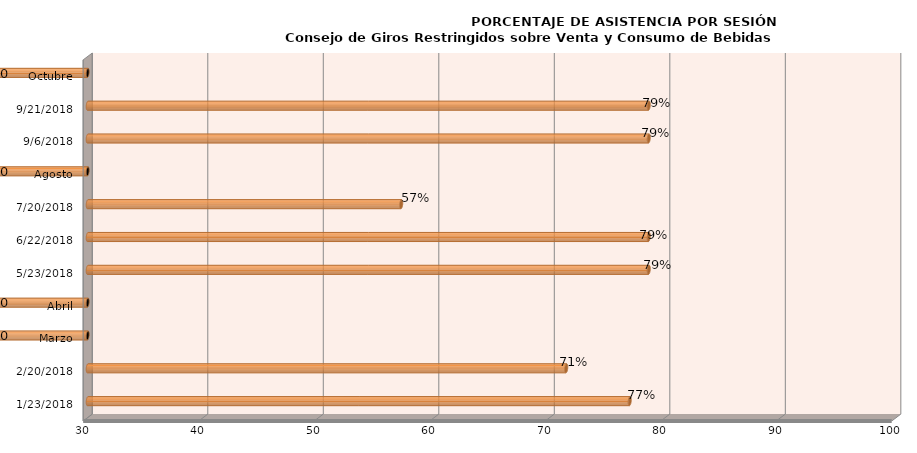
| Category | Series 0 |
|---|---|
| 23/01/2018 | 76.923 |
| 20/02/2018 | 71.429 |
| Marzo | 0 |
| Abril | 0 |
| 23/05/2018 | 78.571 |
| 22/06/2018 | 78.571 |
| 20/07/2018 | 57.143 |
| Agosto | 0 |
| 06/09/2018 | 78.571 |
| 21/09/2018 | 78.571 |
| Octubre | 0 |